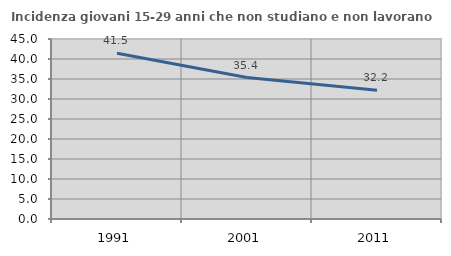
| Category | Incidenza giovani 15-29 anni che non studiano e non lavorano  |
|---|---|
| 1991.0 | 41.455 |
| 2001.0 | 35.368 |
| 2011.0 | 32.192 |